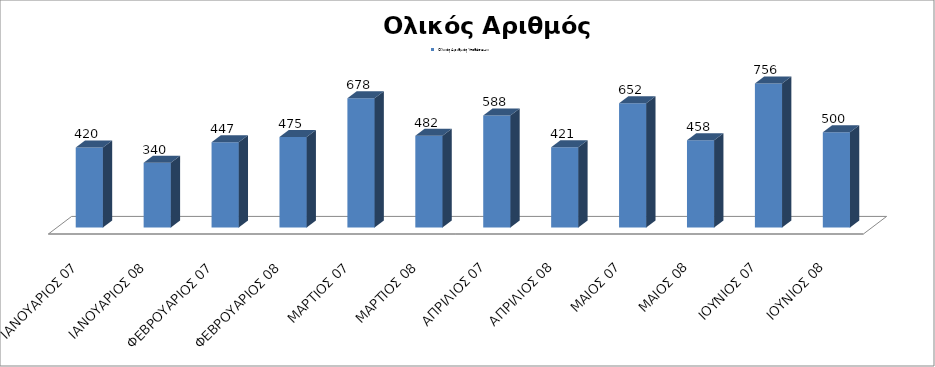
| Category | Ολικός Αριθμός Υποθέσεων: |
|---|---|
| ΙΑΝΟΥΑΡΙΟΣ 07 | 420 |
| ΙΑΝΟΥΑΡΙΟΣ 08 | 340 |
| ΦΕΒΡΟΥΑΡΙΟΣ 07 | 447 |
| ΦΕΒΡΟΥΑΡΙΟΣ 08 | 475 |
| ΜΑΡΤΙΟΣ 07 | 678 |
| ΜΑΡΤΙΟΣ 08 | 482 |
| ΑΠΡΙΛΙΟΣ 07 | 588 |
| ΑΠΡΙΛΙΟΣ 08 | 421 |
| ΜΑΙΟΣ 07 | 652 |
| ΜΑΙΟΣ 08 | 458 |
| ΙΟΥΝΙΟΣ 07 | 756 |
| ΙΟΥΝΙΟΣ 08 | 500 |